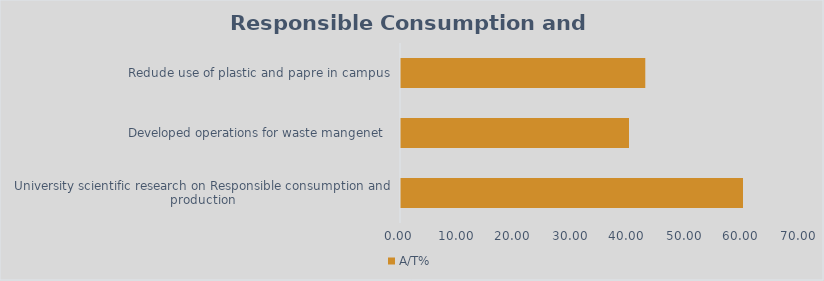
| Category | A/T% |
|---|---|
| University scientific research on Responsible consumption and production | 60 |
| Developed operations for waste mangenet  | 40 |
| Redude use of plastic and papre in campus | 42.857 |